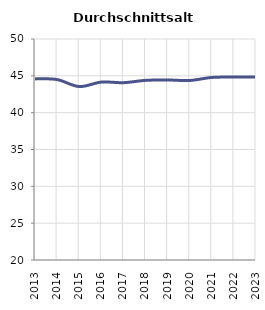
| Category | Durchschnittsalter |
|---|---|
| 2013.0 | 44.588 |
| 2014.0 | 44.495 |
| 2015.0 | 43.543 |
| 2016.0 | 44.15 |
| 2017.0 | 44.07 |
| 2018.0 | 44.384 |
| 2019.0 | 44.438 |
| 2020.0 | 44.37 |
| 2021.0 | 44.78 |
| 2022.0 | 44.83 |
| 2023.0 | 44.825 |